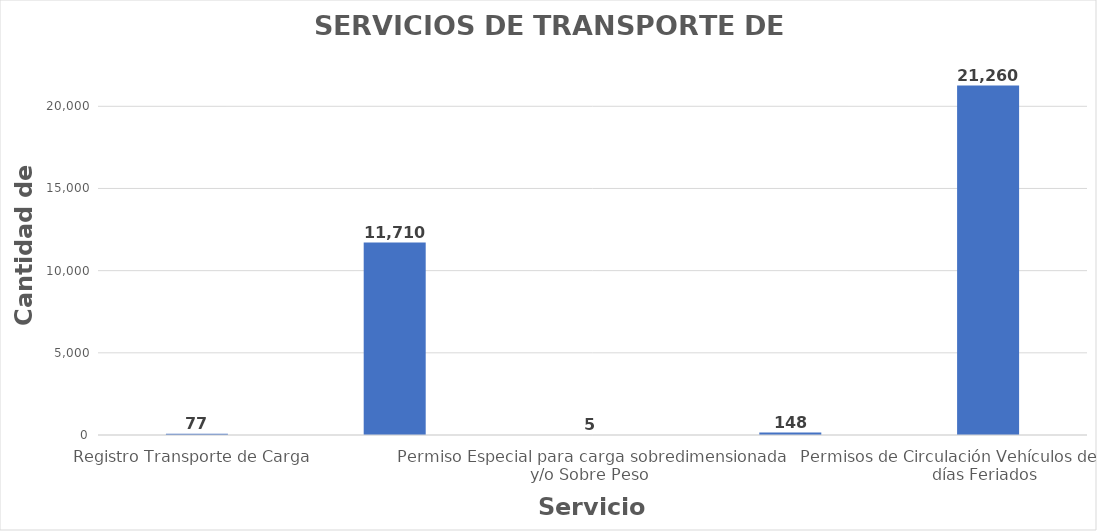
| Category | Series 0 |
|---|---|
| Registro Transporte de Carga  | 77 |
| Permisos de Circulación Vehículos de Carga ZAR | 11710 |
| Permiso Especial para carga sobredimensionada y/o Sobre Peso  | 5 |
| Permiso Especial para Transporte de Doble Cola | 148 |
| Permisos de Circulación Vehículos de Carga en días Feriados  | 21260 |